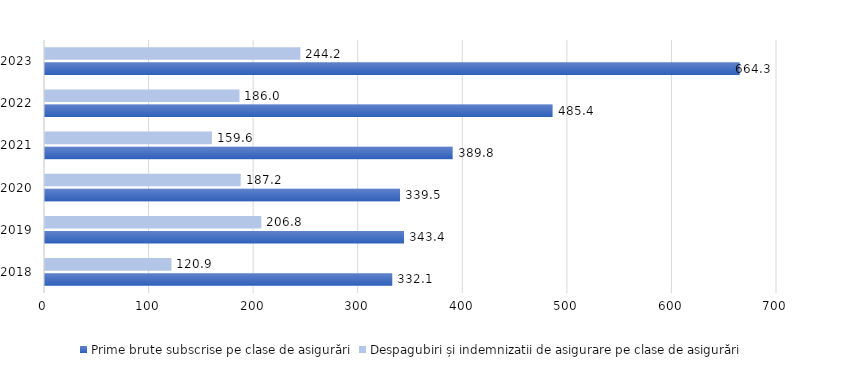
| Category | Prime brute subscrise pe clase de asigurări | Despagubiri și indemnizatii de asigurare pe clase de asigurări |
|---|---|---|
| 2018.0 | 332.1 | 120.92 |
| 2019.0 | 343.351 | 206.848 |
| 2020.0 | 339.53 | 187.164 |
| 2021.0 | 389.831 | 159.599 |
| 2022.0 | 485.389 | 185.984 |
| 2023.0 | 664.302 | 244.211 |